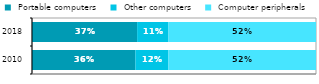
| Category |  Portable computers |  Other computers |  Computer peripherals |
|---|---|---|---|
| 2010.0 | 0.364 | 0.116 | 0.52 |
| 2018.0 | 0.37 | 0.11 | 0.52 |